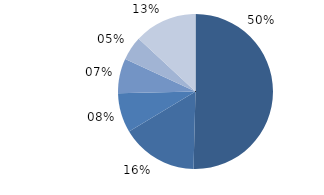
| Category | Bărbați |
|---|---|
| Bolile aparatului circulator | 50.422 |
| Tumori maligne | 15.994 |
| Bolile aparatului digestiv | 8.235 |
| Bolile aparatului respirator | 7.283 |
| Accidente, intoxicaţii şi traumatisme | 5 |
| Alte boli | 13.1 |